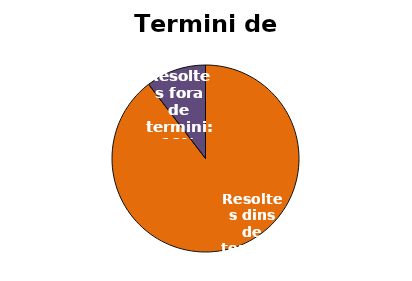
| Category | Series 0 |
|---|---|
| Resoltes dins de termini: | 43 |
| Resoltes fora de termini: | 5 |